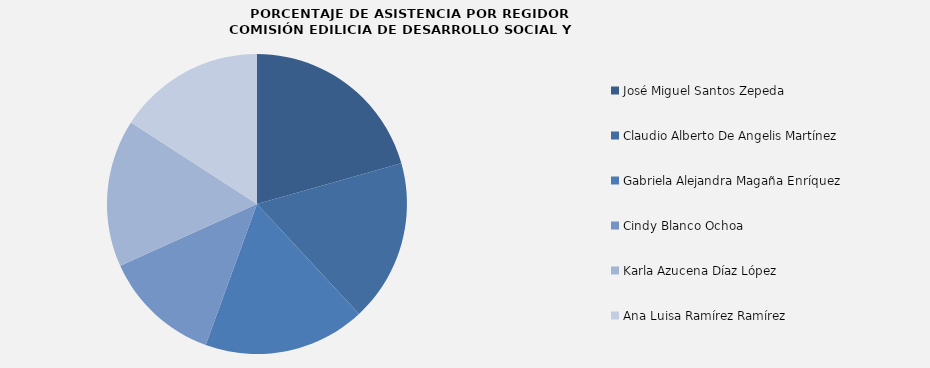
| Category | Series 0 |
|---|---|
| José Miguel Santos Zepeda  | 100 |
| Claudio Alberto De Angelis Martínez | 84.615 |
| Gabriela Alejandra Magaña Enríquez | 84.615 |
| Cindy Blanco Ochoa | 61.538 |
| Karla Azucena Díaz López | 76.923 |
| Ana Luisa Ramírez Ramírez | 76.923 |